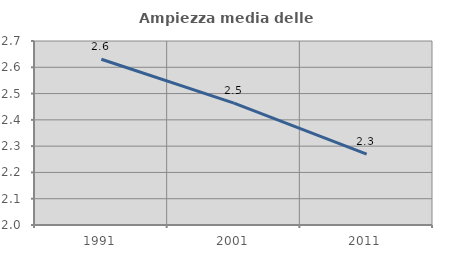
| Category | Ampiezza media delle famiglie |
|---|---|
| 1991.0 | 2.631 |
| 2001.0 | 2.464 |
| 2011.0 | 2.27 |